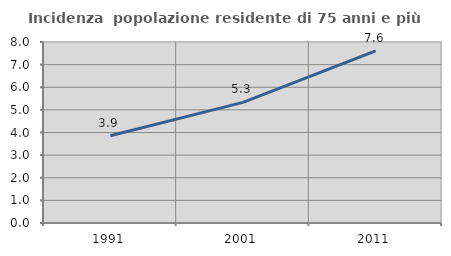
| Category | Incidenza  popolazione residente di 75 anni e più |
|---|---|
| 1991.0 | 3.855 |
| 2001.0 | 5.331 |
| 2011.0 | 7.609 |